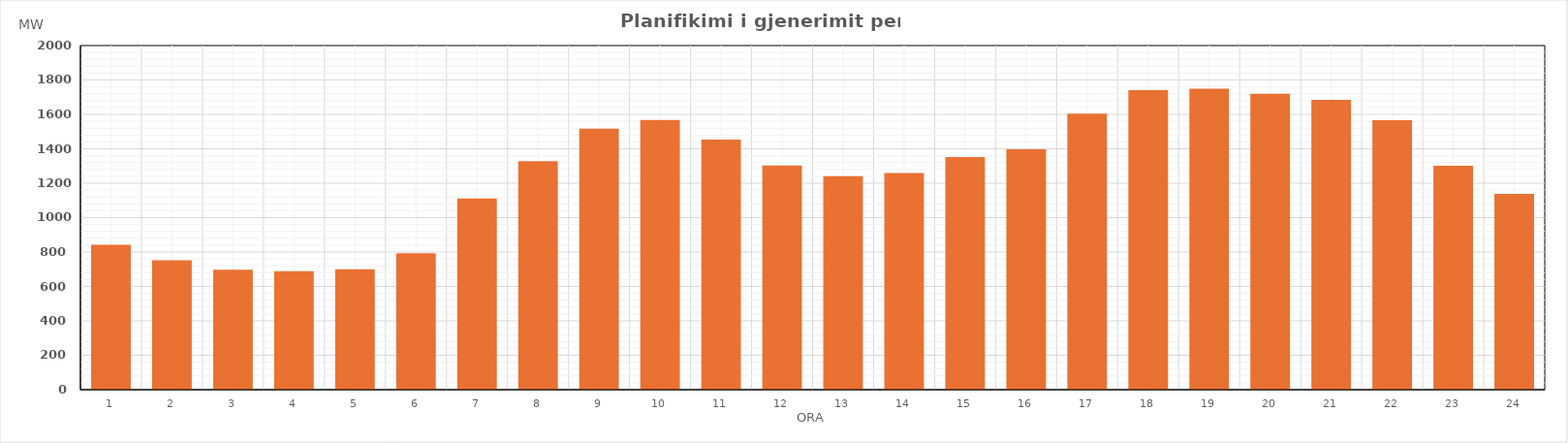
| Category | Max (MW) |
|---|---|
| 0 | 841.59 |
| 1 | 751.99 |
| 2 | 696.65 |
| 3 | 688.48 |
| 4 | 700.27 |
| 5 | 793.63 |
| 6 | 1111.23 |
| 7 | 1328.17 |
| 8 | 1516.33 |
| 9 | 1567.78 |
| 10 | 1453.33 |
| 11 | 1302.63 |
| 12 | 1241.1 |
| 13 | 1258.58 |
| 14 | 1352.16 |
| 15 | 1397.52 |
| 16 | 1603.64 |
| 17 | 1740.46 |
| 18 | 1748.85 |
| 19 | 1719.37 |
| 20 | 1684.69 |
| 21 | 1566.4 |
| 22 | 1301.75 |
| 23 | 1137.75 |